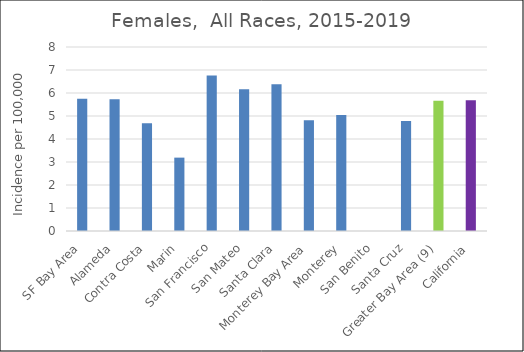
| Category | Female |
|---|---|
| SF Bay Area | 5.75 |
|   Alameda | 5.73 |
|   Contra Costa | 4.68 |
|   Marin | 3.19 |
|   San Francisco | 6.76 |
|   San Mateo | 6.16 |
|   Santa Clara | 6.38 |
| Monterey Bay Area | 4.82 |
|   Monterey | 5.04 |
|   San Benito | 0 |
|   Santa Cruz | 4.78 |
| Greater Bay Area (9) | 5.66 |
| California | 5.68 |